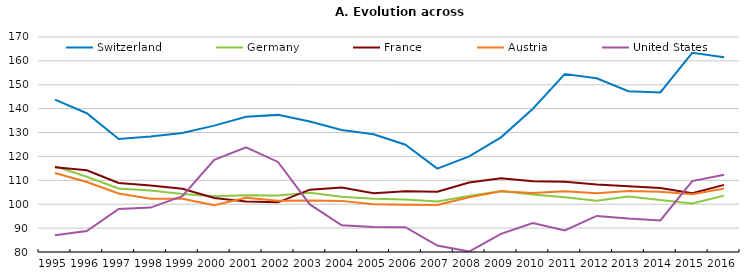
| Category | Switzerland | Germany | France | Austria | United States |
|---|---|---|---|---|---|
| 1995.0 | 143.8 | 115.9 | 115.5 | 113.1 | 87 |
| 1996.0 | 138.1 | 111.5 | 114.2 | 109.3 | 88.8 |
| 1997.0 | 127.3 | 106.6 | 108.9 | 104.5 | 98 |
| 1998.0 | 128.3 | 105.7 | 107.8 | 102.3 | 98.6 |
| 1999.0 | 129.8 | 104.3 | 106.5 | 102.3 | 103.4 |
| 2000.0 | 132.9 | 103.3 | 102.6 | 99.6 | 118.6 |
| 2001.0 | 136.6 | 103.8 | 101.1 | 102.7 | 123.8 |
| 2002.0 | 137.4 | 103.7 | 100.8 | 101.5 | 117.7 |
| 2003.0 | 134.6 | 104.8 | 106.1 | 101.6 | 99.9 |
| 2004.0 | 131.1 | 103.1 | 107 | 101.4 | 91.2 |
| 2005.0 | 129.3 | 102.3 | 104.6 | 100 | 90.5 |
| 2006.0 | 124.9 | 102 | 105.4 | 99.8 | 90.4 |
| 2007.0 | 114.9 | 101.1 | 105.2 | 99.7 | 82.7 |
| 2008.0 | 120 | 103.4 | 109.1 | 102.9 | 80.2 |
| 2009.0 | 128 | 105.5 | 110.9 | 105.4 | 87.6 |
| 2010.0 | 140 | 104.1 | 109.6 | 104.7 | 92.1 |
| 2011.0 | 154.5 | 102.9 | 109.4 | 105.4 | 89 |
| 2012.0 | 152.7 | 101.5 | 108.3 | 104.6 | 95.1 |
| 2013.0 | 147.3 | 103.2 | 107.5 | 105.5 | 94 |
| 2014.0 | 146.8 | 101.8 | 106.8 | 105.2 | 93.2 |
| 2015.0 | 163.4 | 100.3 | 104.6 | 104.2 | 109.7 |
| 2016.0 | 161.5 | 103.6 | 108.1 | 106.6 | 112.3 |